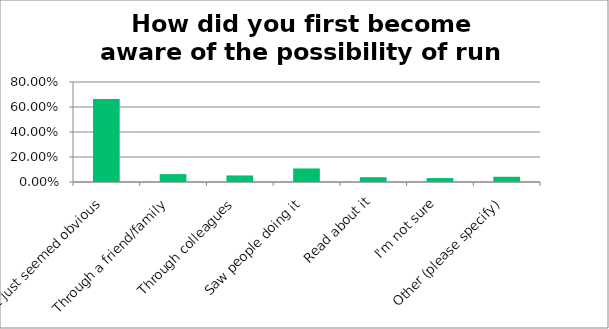
| Category | Responses |
|---|---|
| It just seemed obvious | 0.664 |
| Through a friend/family | 0.063 |
| Through colleagues | 0.052 |
| Saw people doing it | 0.108 |
| Read about it | 0.038 |
| I'm not sure | 0.032 |
| Other (please specify) | 0.042 |